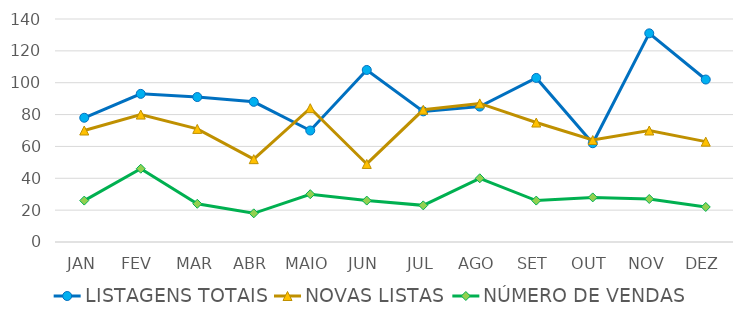
| Category | LISTAGENS TOTAIS | NOVAS LISTAS | NÚMERO DE VENDAS |
|---|---|---|---|
| JAN | 78 | 70 | 26 |
| FEV | 93 | 80 | 46 |
| MAR | 91 | 71 | 24 |
| ABR | 88 | 52 | 18 |
| MAIO | 70 | 84 | 30 |
| JUN | 108 | 49 | 26 |
| JUL | 82 | 83 | 23 |
| AGO | 85 | 87 | 40 |
| SET | 103 | 75 | 26 |
| OUT | 62 | 64 | 28 |
| NOV | 131 | 70 | 27 |
| DEZ | 102 | 63 | 22 |